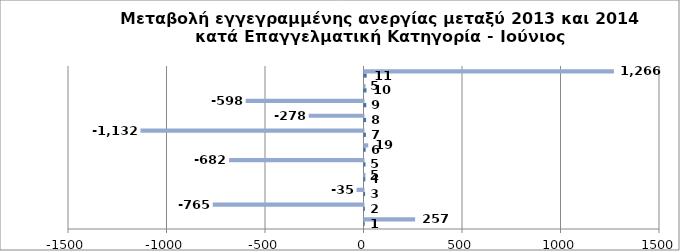
| Category | Series 0 | Series 1 |
|---|---|---|
| 0 | 1 | 257 |
| 1 | 2 | -765 |
| 2 | 3 | -35 |
| 3 | 4 | 5 |
| 4 | 5 | -682 |
| 5 | 6 | 19 |
| 6 | 7 | -1132 |
| 7 | 8 | -278 |
| 8 | 9 | -598 |
| 9 | 10 | 5 |
| 10 | 11 | 1266 |